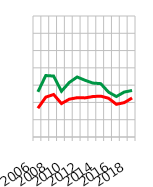
| Category | Schweiz | Kanton SG |
|---|---|---|
| 2006.0 | 98.324 | 103.052 |
| 2007.0 | 101.524 | 107.784 |
| 2008.0 | 102.303 | 107.625 |
| 2009.0 | 99.67 | 103.237 |
| 2010.0 | 100.94 | 105.778 |
| 2011.0 | 101.366 | 107.354 |
| 2012.0 | 101.312 | 106.412 |
| 2013.0 | 101.695 | 105.6 |
| 2014.0 | 101.821 | 105.435 |
| 2015.0 | 101.212 | 102.976 |
| 2016.0 | 99.455 | 101.704 |
| 2017.0 | 99.933 | 103 |
| 2018.0 | 101.282 | 103.449 |